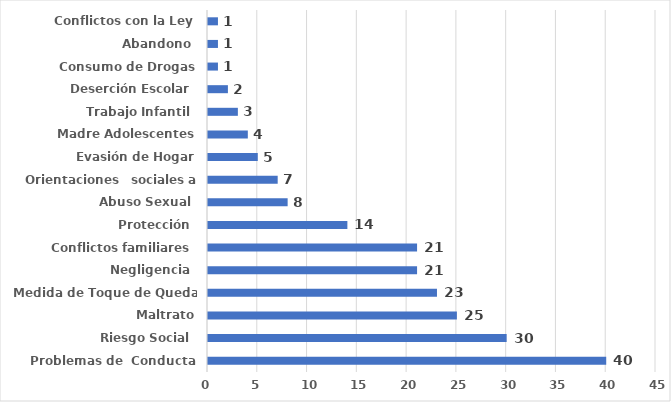
| Category | Series 0 |
|---|---|
| Problemas de  Conducta | 40 |
| Riesgo Social  | 30 |
| Maltrato | 25 |
| Medida de Toque de Queda  | 23 |
| Negligencia  | 21 |
| Conflictos familiares  | 21 |
| Protección  | 14 |
| Abuso Sexual  | 8 |
| Orientaciones   sociales a NNA | 7 |
| Evasión de Hogar | 5 |
| Madre Adolescentes | 4 |
| Trabajo Infantil  | 3 |
| Deserción Escolar  | 2 |
| Consumo de Drogas | 1 |
| Abandono  | 1 |
| Conflictos con la Ley | 1 |